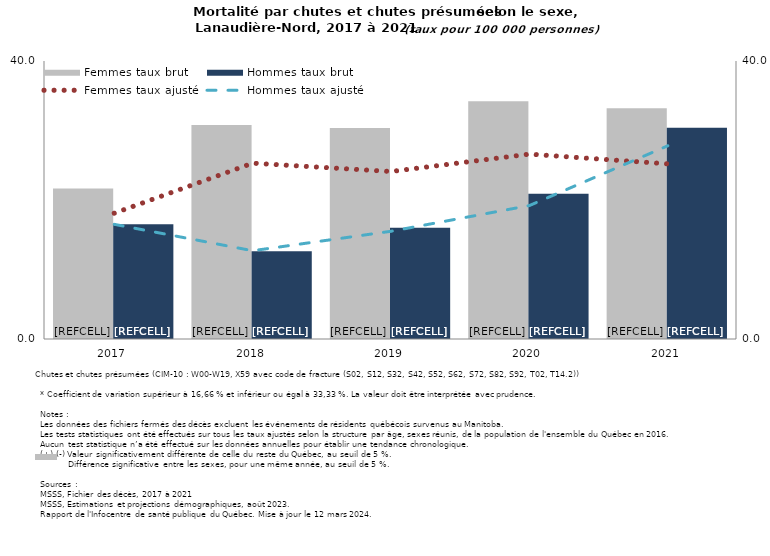
| Category | Femmes taux brut | Hommes taux brut |
|---|---|---|
| 2017.0 | 21.659 | 16.495 |
| 2018.0 | 30.774 | 12.62 |
| 2019.0 | 30.372 | 16.021 |
| 2020.0 | 34.2 | 20.9 |
| 2021.0 | 33.2 | 30.4 |